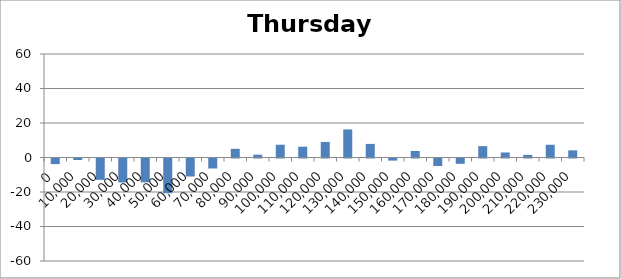
| Category | Thursday 48 |
|---|---|
| 0.0 | -3.252 |
| 10000.0 | -0.857 |
| 20000.0 | -12.386 |
| 30000.0 | -13.886 |
| 40000.0 | -13.795 |
| 50000.0 | -20.133 |
| 60000.0 | -10.424 |
| 70000.0 | -5.79 |
| 80000.0 | 5.038 |
| 90000.0 | 1.638 |
| 100000.0 | 7.4 |
| 110000.0 | 6.252 |
| 120000.0 | 9.024 |
| 130000.0 | 16.276 |
| 140000.0 | 7.886 |
| 150000.0 | -1.238 |
| 160000.0 | 3.786 |
| 170000.0 | -4.362 |
| 180000.0 | -3.09 |
| 190000.0 | 6.595 |
| 200000.0 | 2.919 |
| 210000.0 | 1.519 |
| 220000.0 | 7.38 |
| 230000.0 | 4.15 |